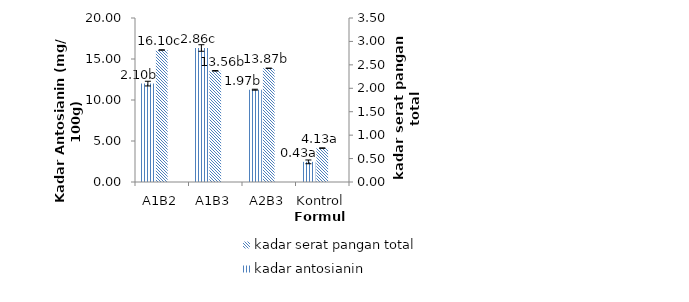
| Category | kadar serat pangan total |
|---|---|
| A1B2 | 16.1 |
| A1B3 | 13.56 |
| A2B3 | 13.87 |
| Kontrol | 4.13 |